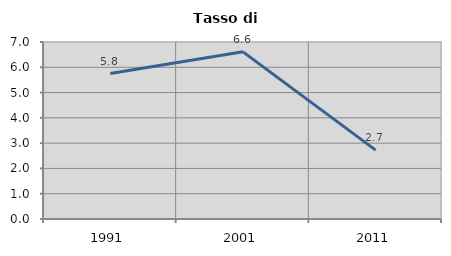
| Category | Tasso di disoccupazione   |
|---|---|
| 1991.0 | 5.752 |
| 2001.0 | 6.611 |
| 2011.0 | 2.725 |